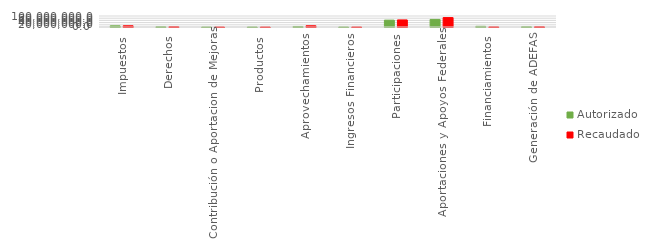
| Category | Autorizado | Recaudado |
|---|---|---|
| Impuestos | 10553505 | 11033434.3 |
| Derechos | 2444230 | 2921766 |
| Contribución o Aportacion de Mejoras | 226450 | 297698.8 |
| Productos | 292889 | 397646.1 |
| Aprovechamientos | 4784305 | 11073084.5 |
| Ingresos Financieros | 310000 | 512029.7 |
| Participaciones | 62277520 | 64250826 |
| Aportaciones y Apoyos Federales | 69082765 | 85581854.8 |
| Financiamientos | 6000000 | 1253727 |
| Generación de ADEFAS | 2460661 | 2460611.4 |